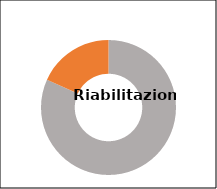
| Category | Series 0 |
|---|---|
| Donne  | 0.818 |
| Uomini  | 0.182 |